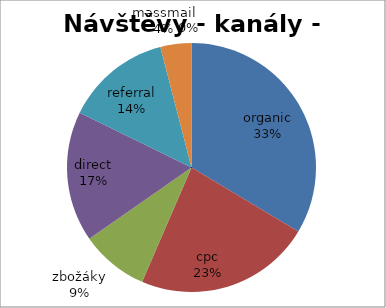
| Category | Series 0 |
|---|---|
| organic | 70470.322 |
| cpc | 48071.729 |
| zbožáky | 18529.956 |
| direct | 35520.023 |
| referral | 28821.02 |
| massmail | 8445.879 |